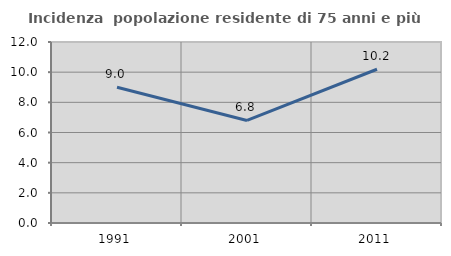
| Category | Incidenza  popolazione residente di 75 anni e più |
|---|---|
| 1991.0 | 8.995 |
| 2001.0 | 6.799 |
| 2011.0 | 10.192 |